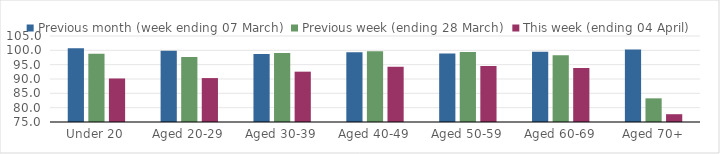
| Category | Previous month (week ending 07 March) | Previous week (ending 28 March) | This week (ending 04 April) |
|---|---|---|---|
| Under 20 | 100.691 | 98.765 | 90.184 |
| Aged 20-29 | 99.885 | 97.676 | 90.323 |
| Aged 30-39 | 98.724 | 99.113 | 92.558 |
| Aged 40-49 | 99.307 | 99.663 | 94.279 |
| Aged 50-59 | 98.929 | 99.439 | 94.574 |
| Aged 60-69 | 99.494 | 98.271 | 93.827 |
| Aged 70+ | 100.311 | 83.252 | 77.719 |